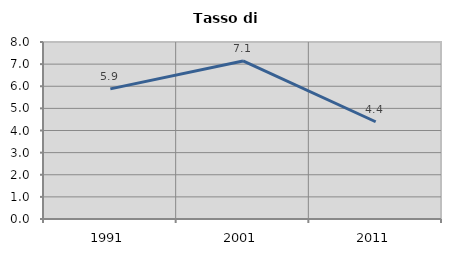
| Category | Tasso di disoccupazione   |
|---|---|
| 1991.0 | 5.882 |
| 2001.0 | 7.143 |
| 2011.0 | 4.396 |